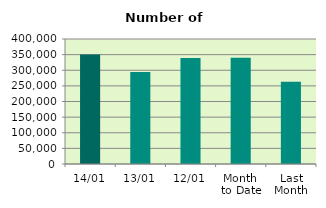
| Category | Series 0 |
|---|---|
| 14/01 | 350560 |
| 13/01 | 294658 |
| 12/01 | 339318 |
| Month 
to Date | 339948.2 |
| Last
Month | 263242 |